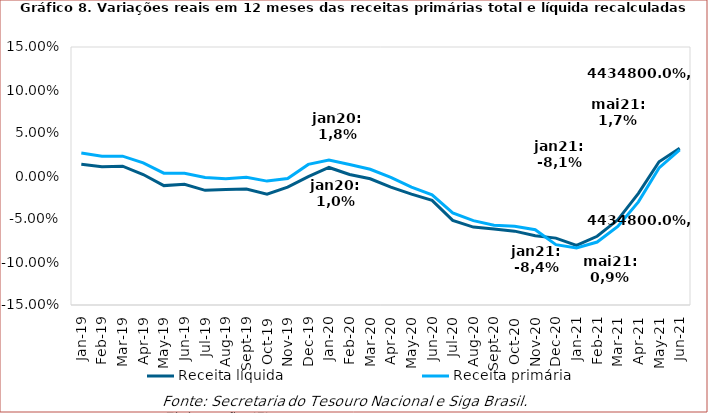
| Category | Receita líquida | Receita primária |
|---|---|---|
| 2019-01-01 | 0.014 | 0.027 |
| 2019-02-01 | 0.011 | 0.023 |
| 2019-03-01 | 0.011 | 0.023 |
| 2019-04-01 | 0.002 | 0.015 |
| 2019-05-01 | -0.011 | 0.003 |
| 2019-06-01 | -0.01 | 0.003 |
| 2019-07-01 | -0.017 | -0.002 |
| 2019-08-01 | -0.016 | -0.003 |
| 2019-09-01 | -0.015 | -0.001 |
| 2019-10-01 | -0.021 | -0.006 |
| 2019-11-01 | -0.013 | -0.003 |
| 2019-12-01 | -0.001 | 0.013 |
| 2020-01-01 | 0.01 | 0.018 |
| 2020-02-01 | 0.002 | 0.013 |
| 2020-03-01 | -0.003 | 0.008 |
| 2020-04-01 | -0.013 | -0.002 |
| 2020-05-01 | -0.021 | -0.013 |
| 2020-06-01 | -0.028 | -0.022 |
| 2020-07-01 | -0.052 | -0.043 |
| 2020-08-01 | -0.059 | -0.052 |
| 2020-09-01 | -0.062 | -0.057 |
| 2020-10-01 | -0.064 | -0.058 |
| 2020-11-01 | -0.069 | -0.062 |
| 2020-12-01 | -0.072 | -0.08 |
| 2021-01-01 | -0.081 | -0.084 |
| 2021-02-01 | -0.07 | -0.077 |
| 2021-03-01 | -0.051 | -0.059 |
| 2021-04-01 | -0.02 | -0.03 |
| 2021-05-01 | 0.017 | 0.009 |
| 2021-06-01 | 0.032 | 0.03 |